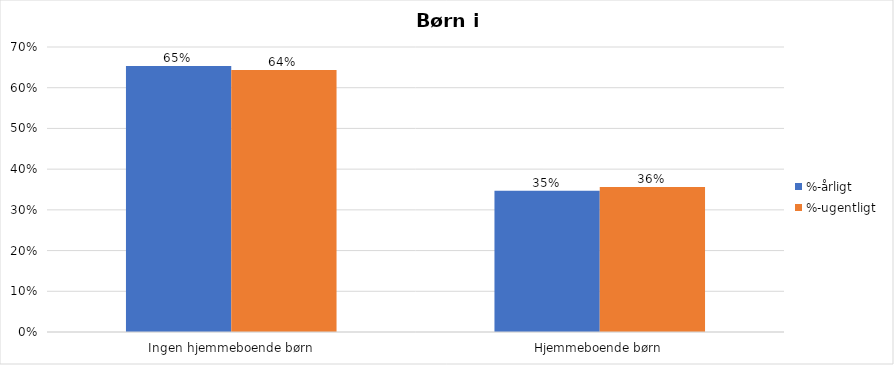
| Category | %-årligt | %-ugentligt |
|---|---|---|
| Ingen hjemmeboende børn | 0.653 | 0.644 |
| Hjemmeboende børn | 0.347 | 0.356 |